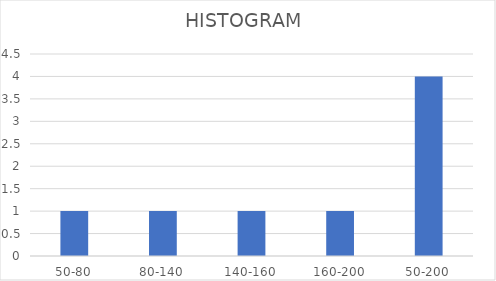
| Category | Series 0 |
|---|---|
| 50-80 | 1 |
| 80-140 | 1 |
| 140-160 | 1 |
| 160-200 | 1 |
| 50-200 | 4 |